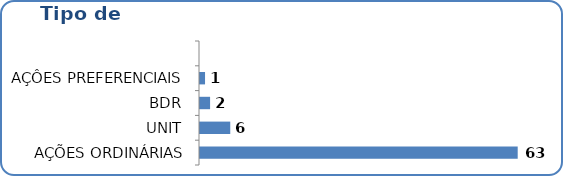
| Category | Tipo de Ativo |
|---|---|
| AÇÕES ORDINÁRIAS | 63 |
| UNIT | 6 |
| BDR | 2 |
| AÇÔES PREFERENCIAIS | 1 |